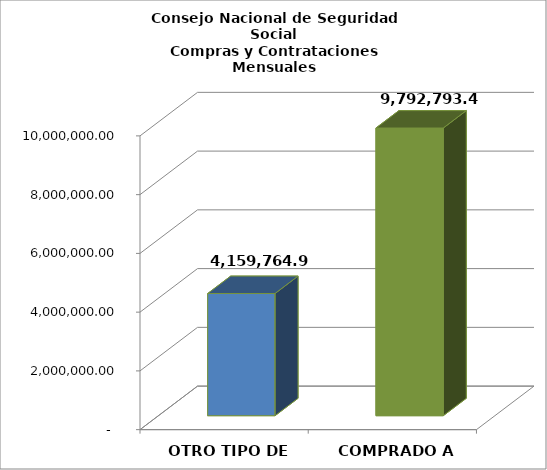
| Category | TOTAL |
|---|---|
| OTRO TIPO DE EMPRESA | 4159764.96 |
| COMPRADO A PYMES             | 9792793.47 |